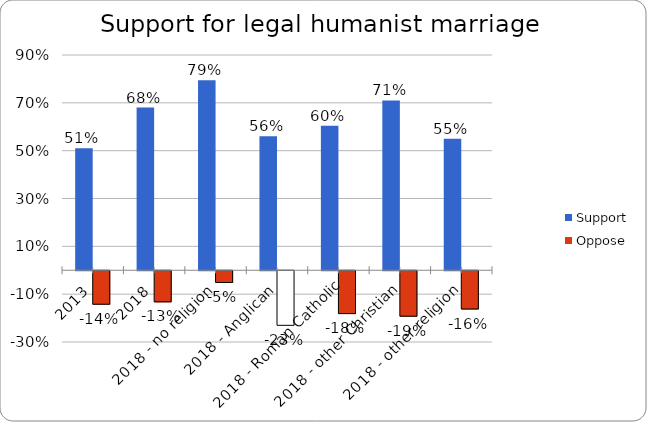
| Category | Support | Oppose |
|---|---|---|
| 2013 | 0.51 | -0.14 |
| 2018 | 0.68 | -0.13 |
| 2018 - no religion | 0.794 | -0.049 |
| 2018 - Anglican | 0.56 | -0.228 |
| 2018 - Roman Catholic | 0.605 | -0.179 |
| 2018 - other Christian | 0.71 | -0.19 |
| 2018 - other religion | 0.55 | -0.16 |